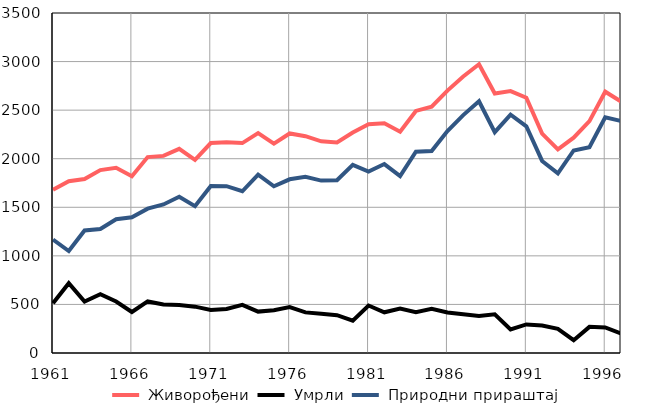
| Category |  Живорођени |  Умрли |  Природни прираштај |
|---|---|---|---|
| 1961.0 | 1680 | 512 | 1168 |
| 1962.0 | 1768 | 718 | 1050 |
| 1963.0 | 1791 | 530 | 1261 |
| 1964.0 | 1883 | 606 | 1277 |
| 1965.0 | 1907 | 530 | 1377 |
| 1966.0 | 1819 | 422 | 1397 |
| 1967.0 | 2017 | 531 | 1486 |
| 1968.0 | 2029 | 500 | 1529 |
| 1969.0 | 2102 | 493 | 1609 |
| 1970.0 | 1989 | 477 | 1512 |
| 1971.0 | 2161 | 443 | 1718 |
| 1972.0 | 2170 | 453 | 1717 |
| 1973.0 | 2161 | 496 | 1665 |
| 1974.0 | 2263 | 426 | 1837 |
| 1975.0 | 2156 | 440 | 1716 |
| 1976.0 | 2260 | 472 | 1788 |
| 1977.0 | 2232 | 418 | 1814 |
| 1978.0 | 2179 | 404 | 1775 |
| 1979.0 | 2167 | 389 | 1778 |
| 1980.0 | 2269 | 332 | 1937 |
| 1981.0 | 2356 | 489 | 1867 |
| 1982.0 | 2364 | 419 | 1945 |
| 1983.0 | 2278 | 458 | 1820 |
| 1984.0 | 2492 | 420 | 2072 |
| 1985.0 | 2535 | 456 | 2079 |
| 1986.0 | 2701 | 417 | 2284 |
| 1987.0 | 2847 | 398 | 2449 |
| 1988.0 | 2973 | 382 | 2591 |
| 1989.0 | 2671 | 398 | 2273 |
| 1990.0 | 2696 | 243 | 2453 |
| 1991.0 | 2628 | 294 | 2334 |
| 1992.0 | 2259 | 282 | 1977 |
| 1993.0 | 2097 | 248 | 1849 |
| 1994.0 | 2217 | 132 | 2085 |
| 1995.0 | 2387 | 269 | 2118 |
| 1996.0 | 2690 | 263 | 2427 |
| 1997.0 | 2588 | 200 | 2388 |